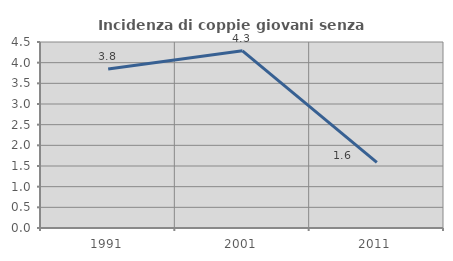
| Category | Incidenza di coppie giovani senza figli |
|---|---|
| 1991.0 | 3.846 |
| 2001.0 | 4.286 |
| 2011.0 | 1.587 |